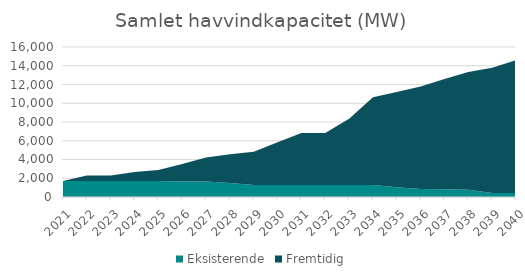
| Category | Eksisterende | Fremtidig |
|---|---|---|
| 2021.0 | 1700.8 | 0 |
| 2022.0 | 1700.8 | 605 |
| 2023.0 | 1700.8 | 605 |
| 2024.0 | 1700.8 | 955 |
| 2025.0 | 1700.8 | 1180 |
| 2026.0 | 1655.8 | 1865 |
| 2027.0 | 1655.8 | 2555 |
| 2028.0 | 1495.8 | 3055 |
| 2029.0 | 1284.7 | 3555 |
| 2030.0 | 1284.7 | 4555 |
| 2031.0 | 1284.7 | 5555 |
| 2032.0 | 1284.7 | 5555 |
| 2033.0 | 1284.7 | 7055 |
| 2034.0 | 1284.7 | 9355 |
| 2035.0 | 1047.2 | 10155 |
| 2036.0 | 840.2 | 10955 |
| 2037.0 | 836.6 | 11755 |
| 2038.0 | 786.2 | 12555 |
| 2039.0 | 437 | 13355 |
| 2040.0 | 437 | 14155 |